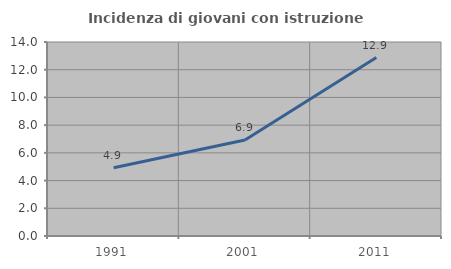
| Category | Incidenza di giovani con istruzione universitaria |
|---|---|
| 1991.0 | 4.93 |
| 2001.0 | 6.923 |
| 2011.0 | 12.879 |